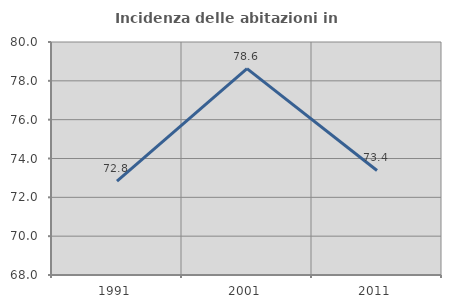
| Category | Incidenza delle abitazioni in proprietà  |
|---|---|
| 1991.0 | 72.832 |
| 2001.0 | 78.626 |
| 2011.0 | 73.383 |